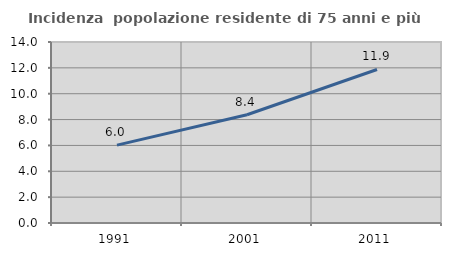
| Category | Incidenza  popolazione residente di 75 anni e più |
|---|---|
| 1991.0 | 6.026 |
| 2001.0 | 8.371 |
| 2011.0 | 11.874 |